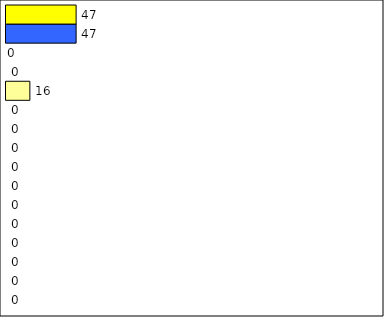
| Category | -2 | -1 | 0 | 1 | 2 | 3 | 4 | 5 | 6 | 7 | 8 | 9 | 10 | 11 | 12 | Perfect Round |
|---|---|---|---|---|---|---|---|---|---|---|---|---|---|---|---|---|
| 0 | 0 | 0 | 0 | 0 | 0 | 0 | 0 | 0 | 0 | 0 | 0 | 16 | 0 | 0 | 47 | 47 |